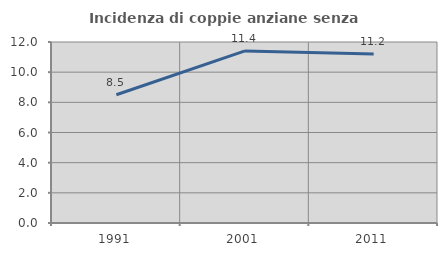
| Category | Incidenza di coppie anziane senza figli  |
|---|---|
| 1991.0 | 8.502 |
| 2001.0 | 11.407 |
| 2011.0 | 11.197 |